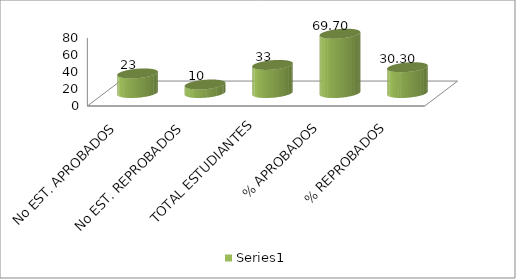
| Category | Series 0 |
|---|---|
| No EST. APROBADOS | 23 |
| No EST. REPROBADOS | 10 |
| TOTAL ESTUDIANTES | 33 |
| % APROBADOS | 69.697 |
| % REPROBADOS | 30.303 |